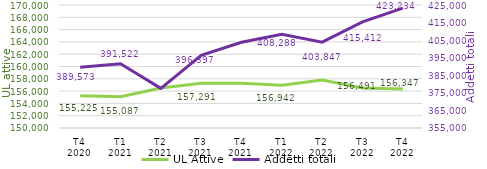
| Category | UL Attive |
|---|---|
| T4
2020 | 155225 |
| T1
2021 | 155087 |
| T2
2021 | 156494 |
| T3
2021 | 157291 |
| T4
2021 | 157277 |
| T1
2022 | 156942 |
| T2
2022 | 157813 |
| T3
2022 | 156491 |
| T4
2022 | 156347 |